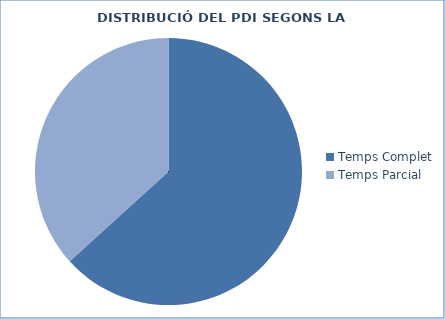
| Category | Series 0 |
|---|---|
| Temps Complet | 1680 |
| Temps Parcial | 976 |